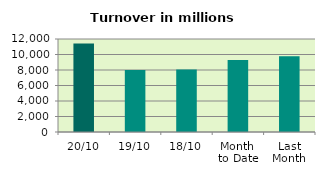
| Category | Series 0 |
|---|---|
| 20/10 | 11420.576 |
| 19/10 | 8008.716 |
| 18/10 | 8057.256 |
| Month 
to Date | 9279.013 |
| Last
Month | 9769.37 |